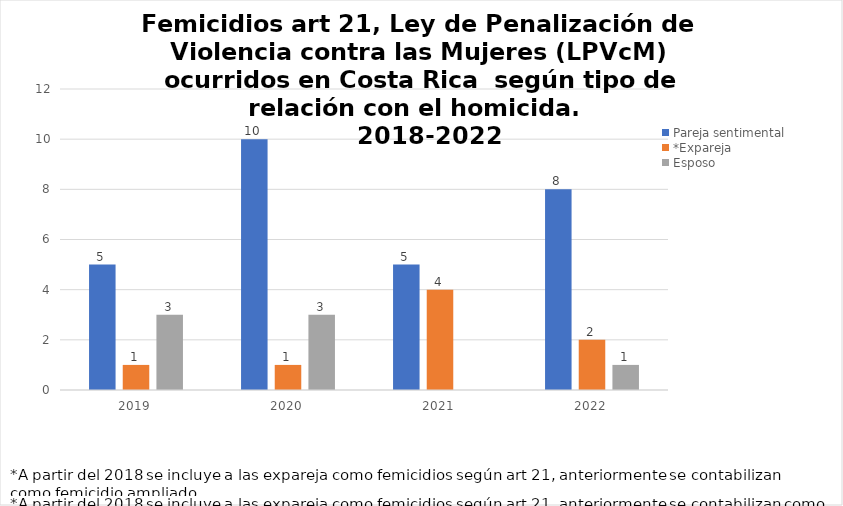
| Category | Pareja sentimental | *Expareja | Esposo |
|---|---|---|---|
| 2019.0 | 5 | 1 | 3 |
| 2020.0 | 10 | 1 | 3 |
| 2021.0 | 5 | 4 | 0 |
| 2022.0 | 8 | 2 | 1 |